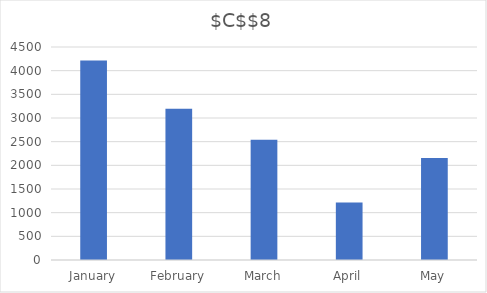
| Category | $C$$8 |
|---|---|
| January | 4213 |
| February | 3194 |
| March | 2541 |
| April | 1214 |
| May | 2154 |